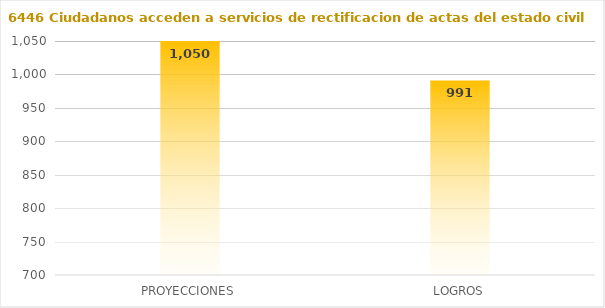
| Category | 6446 |
|---|---|
| PROYECCIONES | 1050 |
| LOGROS | 991 |